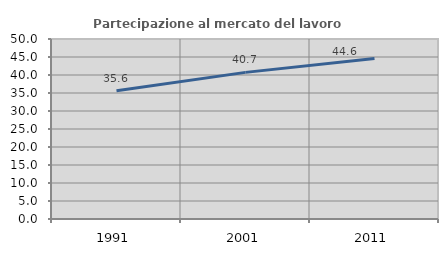
| Category | Partecipazione al mercato del lavoro  femminile |
|---|---|
| 1991.0 | 35.631 |
| 2001.0 | 40.73 |
| 2011.0 | 44.61 |